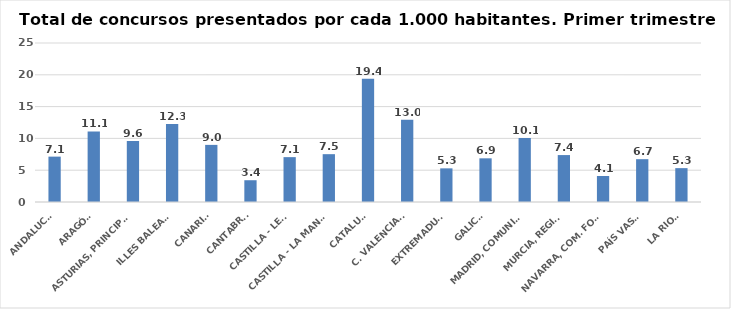
| Category | 616 |
|---|---|
| ANDALUCÍA | 7.134 |
| ARAGÓN | 11.091 |
| ASTURIAS, PRINCIPADO | 9.589 |
| ILLES BALEARS | 12.283 |
| CANARIAS | 8.981 |
| CANTABRIA | 3.423 |
| CASTILLA - LEÓN | 7.055 |
| CASTILLA - LA MANCHA | 7.52 |
| CATALUÑA | 19.389 |
| C. VALENCIANA | 12.952 |
| EXTREMADURA | 5.289 |
| GALICIA | 6.866 |
| MADRID, COMUNIDAD | 10.081 |
| MURCIA, REGIÓN | 7.378 |
| NAVARRA, COM. FORAL | 4.085 |
| PAÍS VASCO | 6.734 |
| LA RIOJA | 5.325 |